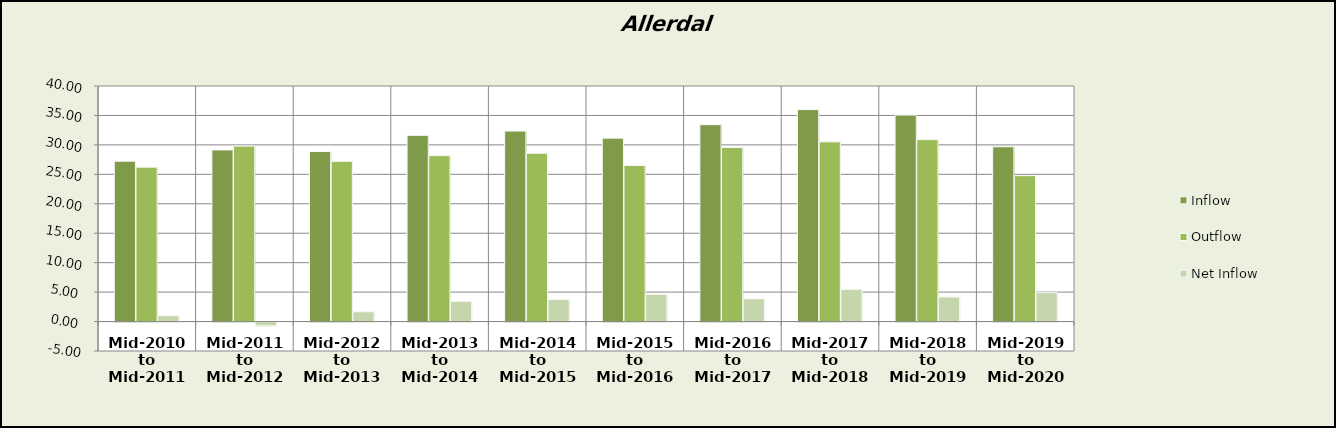
| Category | Inflow | Outflow | Net Inflow |
|---|---|---|---|
| Mid-2010 to Mid-2011 | 27.228 | 26.222 | 1.006 |
| Mid-2011 to Mid-2012 | 29.147 | 29.792 | -0.644 |
| Mid-2012 to Mid-2013 | 28.877 | 27.215 | 1.662 |
| Mid-2013 to Mid-2014 | 31.616 | 28.177 | 3.439 |
| Mid-2014 to Mid-2015 | 32.349 | 28.587 | 3.762 |
| Mid-2015 to Mid-2016 | 31.143 | 26.509 | 4.634 |
| Mid-2016 to Mid-2017 | 33.432 | 29.574 | 3.858 |
| Mid-2017 to Mid-2018 | 35.99 | 30.515 | 5.475 |
| Mid-2018 to Mid-2019 | 35.065 | 30.892 | 4.173 |
| Mid-2019 to Mid-2020 | 29.684 | 24.777 | 4.906 |